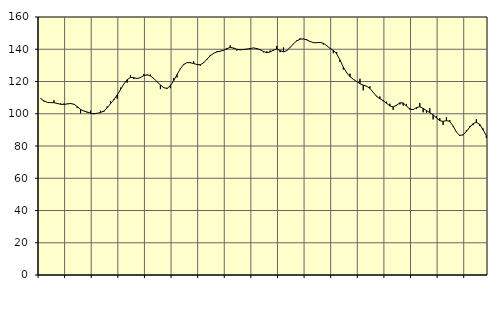
| Category | Piggar | Series 1 |
|---|---|---|
| nan | 109.6 | 109.36 |
| 87.0 | 107.6 | 107.99 |
| 87.0 | 107 | 107.05 |
| 87.0 | 107 | 106.88 |
| nan | 108.4 | 106.86 |
| 88.0 | 106 | 106.39 |
| 88.0 | 106.4 | 105.88 |
| 88.0 | 106.3 | 105.81 |
| nan | 106.3 | 106.06 |
| 89.0 | 106.6 | 106.34 |
| 89.0 | 105.6 | 105.93 |
| 89.0 | 103.6 | 104.45 |
| nan | 100.3 | 102.7 |
| 90.0 | 101.9 | 101.67 |
| 90.0 | 100.7 | 101.09 |
| 90.0 | 101.9 | 100.37 |
| nan | 99.7 | 100.04 |
| 91.0 | 100.2 | 100.3 |
| 91.0 | 101.9 | 100.79 |
| 91.0 | 101.2 | 101.69 |
| nan | 104.5 | 103.66 |
| 92.0 | 107.7 | 106.22 |
| 92.0 | 109.2 | 108.7 |
| 92.0 | 109.4 | 111.6 |
| nan | 116.2 | 114.93 |
| 93.0 | 118.5 | 118.37 |
| 93.0 | 119.3 | 121.13 |
| 93.0 | 123.9 | 122.52 |
| nan | 121.5 | 122.36 |
| 94.0 | 121.9 | 121.84 |
| 94.0 | 122.8 | 122.42 |
| 94.0 | 124.6 | 123.65 |
| nan | 123.9 | 124.18 |
| 95.0 | 124.3 | 123.46 |
| 95.0 | 122.1 | 121.9 |
| 95.0 | 120.1 | 119.84 |
| nan | 115.3 | 117.86 |
| 96.0 | 116.3 | 116.16 |
| 96.0 | 115.4 | 115.72 |
| 96.0 | 115.9 | 117.42 |
| nan | 122.2 | 120.57 |
| 97.0 | 122.5 | 124.3 |
| 97.0 | 128.2 | 127.85 |
| 97.0 | 130.9 | 130.55 |
| nan | 131.7 | 131.74 |
| 98.0 | 131.4 | 131.66 |
| 98.0 | 132.5 | 131.15 |
| 98.0 | 130.6 | 130.54 |
| nan | 129.8 | 130.38 |
| 99.0 | 132.1 | 131.62 |
| 99.0 | 133.5 | 133.83 |
| 99.0 | 136.5 | 135.92 |
| nan | 137.2 | 137.48 |
| 0.0 | 138.7 | 138.39 |
| 0.0 | 138.6 | 138.81 |
| 0.0 | 139.5 | 139.37 |
| nan | 139.8 | 140.42 |
| 1.0 | 142.4 | 141.12 |
| 1.0 | 140.2 | 140.77 |
| 1.0 | 139.2 | 139.95 |
| nan | 140 | 139.63 |
| 2.0 | 139.8 | 139.86 |
| 2.0 | 139.9 | 140.11 |
| 2.0 | 139.8 | 140.46 |
| nan | 140.9 | 140.78 |
| 3.0 | 140 | 140.46 |
| 3.0 | 140 | 139.64 |
| 3.0 | 138.1 | 138.61 |
| nan | 138.7 | 137.9 |
| 4.0 | 139.2 | 138.3 |
| 4.0 | 139.2 | 139.49 |
| 4.0 | 142.1 | 140.1 |
| nan | 138.2 | 139.23 |
| 5.0 | 141.1 | 138.39 |
| 5.0 | 139.3 | 139.11 |
| 5.0 | 141.3 | 141.09 |
| nan | 143.2 | 143.38 |
| 6.0 | 145.5 | 145.17 |
| 6.0 | 146.8 | 146.24 |
| 6.0 | 146.6 | 146.41 |
| nan | 146.3 | 145.78 |
| 7.0 | 144.6 | 144.82 |
| 7.0 | 143.9 | 144.08 |
| 7.0 | 144.2 | 144.05 |
| nan | 144 | 144.25 |
| 8.0 | 142.9 | 143.69 |
| 8.0 | 142 | 142.22 |
| 8.0 | 140.4 | 140.6 |
| nan | 137.6 | 139.29 |
| 9.0 | 138.2 | 137.16 |
| 9.0 | 132.3 | 133.35 |
| 9.0 | 127.4 | 128.92 |
| nan | 125.8 | 125.42 |
| 10.0 | 124.9 | 123.02 |
| 10.0 | 121.3 | 121.39 |
| 10.0 | 120 | 120 |
| nan | 121.7 | 118.62 |
| 11.0 | 114.5 | 117.77 |
| 11.0 | 117 | 117.14 |
| 11.0 | 117 | 115.72 |
| nan | 113.4 | 113.26 |
| 12.0 | 111.1 | 110.76 |
| 12.0 | 110.7 | 109.3 |
| 12.0 | 107.7 | 108.14 |
| nan | 107.5 | 106.5 |
| 13.0 | 106.2 | 104.83 |
| 13.0 | 102.4 | 104.26 |
| 13.0 | 104.8 | 105.29 |
| nan | 105.8 | 106.78 |
| 14.0 | 105.1 | 106.69 |
| 14.0 | 106.1 | 104.79 |
| 14.0 | 103.6 | 102.81 |
| nan | 102.4 | 102.6 |
| 15.0 | 102.9 | 103.87 |
| 15.0 | 106.6 | 104.31 |
| 15.0 | 100.9 | 103.37 |
| nan | 100.6 | 101.98 |
| 16.0 | 103.4 | 100.67 |
| 16.0 | 96.5 | 99.35 |
| 16.0 | 98.4 | 97.41 |
| nan | 97.3 | 95.69 |
| 17.0 | 93 | 95.3 |
| 17.0 | 97.8 | 95.71 |
| 17.0 | 96.1 | 95.29 |
| nan | 92.1 | 92.4 |
| 18.0 | 88.8 | 88.67 |
| 18.0 | 86.2 | 86.59 |
| 18.0 | 86.7 | 86.92 |
| nan | 89.7 | 89.02 |
| 19.0 | 92.2 | 91.66 |
| 19.0 | 92.9 | 93.84 |
| 19.0 | 96.7 | 94.64 |
| nan | 92.4 | 93.45 |
| 20.0 | 90.9 | 90.15 |
| 20.0 | 85.1 | 86.41 |